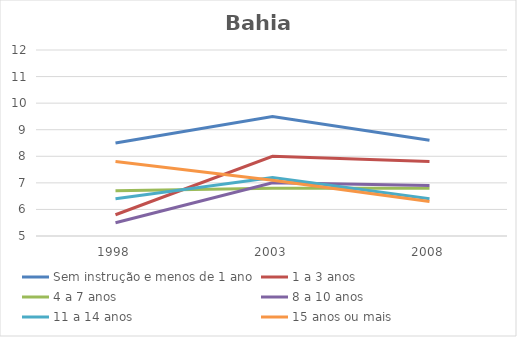
| Category | Sem instrução e menos de 1 ano | 1 a 3 anos | 4 a 7 anos | 8 a 10 anos | 11 a 14 anos | 15 anos ou mais |
|---|---|---|---|---|---|---|
| 1998.0 | 8.5 | 5.8 | 6.7 | 5.5 | 6.4 | 7.8 |
| 2003.0 | 9.5 | 8 | 6.8 | 7 | 7.2 | 7.1 |
| 2008.0 | 8.6 | 7.8 | 6.8 | 6.9 | 6.4 | 6.3 |